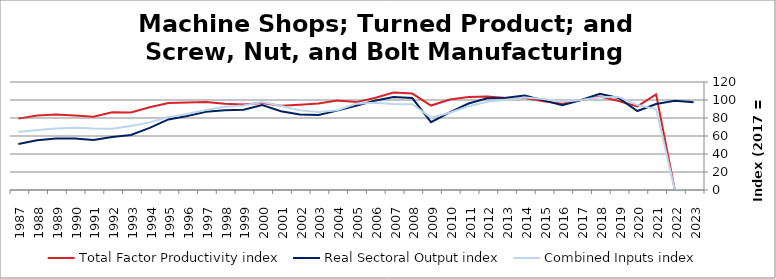
| Category | Total Factor Productivity index | Real Sectoral Output index | Combined Inputs index |
|---|---|---|---|
| 2023.0 | 0 | 97.629 | 0 |
| 2022.0 | 0 | 99.13 | 0 |
| 2021.0 | 106.212 | 95.551 | 89.963 |
| 2020.0 | 92.936 | 87.738 | 94.407 |
| 2019.0 | 98.896 | 102.302 | 103.445 |
| 2018.0 | 103.816 | 106.986 | 103.053 |
| 2017.0 | 100 | 100 | 100 |
| 2016.0 | 95.931 | 94.145 | 98.138 |
| 2015.0 | 98.48 | 99.608 | 101.145 |
| 2014.0 | 102.147 | 104.96 | 102.754 |
| 2013.0 | 102.332 | 102.503 | 100.167 |
| 2012.0 | 103.923 | 101.858 | 98.013 |
| 2011.0 | 103.207 | 96.077 | 93.092 |
| 2010.0 | 100.492 | 86.284 | 85.862 |
| 2009.0 | 93.849 | 75.411 | 80.354 |
| 2008.0 | 107.111 | 102.191 | 95.407 |
| 2007.0 | 108.195 | 103.358 | 95.529 |
| 2006.0 | 102.292 | 99.125 | 96.904 |
| 2005.0 | 97.665 | 93.592 | 95.829 |
| 2004.0 | 99.518 | 88.207 | 88.635 |
| 2003.0 | 96.106 | 83.286 | 86.661 |
| 2002.0 | 94.633 | 83.832 | 88.586 |
| 2001.0 | 93.52 | 87.421 | 93.479 |
| 2000.0 | 96.65 | 94.357 | 97.627 |
| 1999.0 | 95.03 | 89.167 | 93.831 |
| 1998.0 | 95.743 | 88.506 | 92.441 |
| 1997.0 | 97.885 | 86.908 | 88.785 |
| 1996.0 | 97.216 | 82.19 | 84.544 |
| 1995.0 | 96.729 | 78.416 | 81.068 |
| 1994.0 | 91.924 | 69.079 | 75.148 |
| 1993.0 | 86.061 | 61.166 | 71.073 |
| 1992.0 | 86.447 | 58.816 | 68.036 |
| 1991.0 | 81.358 | 55.502 | 68.22 |
| 1990.0 | 82.727 | 57.186 | 69.126 |
| 1989.0 | 83.826 | 57.271 | 68.321 |
| 1988.0 | 82.845 | 55.185 | 66.613 |
| 1987.0 | 79.297 | 51.197 | 64.564 |